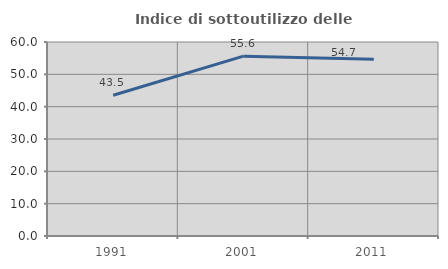
| Category | Indice di sottoutilizzo delle abitazioni  |
|---|---|
| 1991.0 | 43.514 |
| 2001.0 | 55.63 |
| 2011.0 | 54.675 |